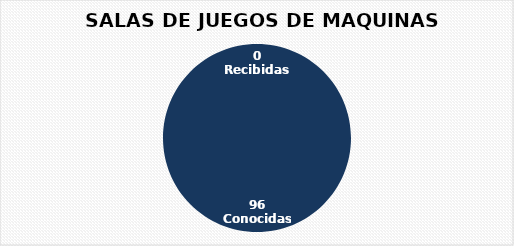
| Category | Series 0 |
|---|---|
| 0 | 0 |
| 1 | 96 |